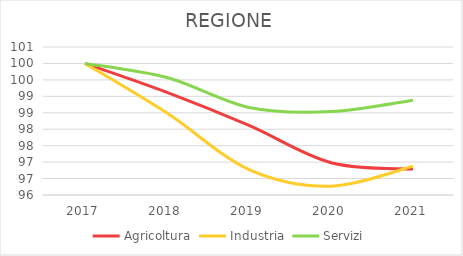
| Category | Agricoltura | Industria | Servizi |
|---|---|---|---|
| 2017.0 | 100 | 100 | 100 |
| 2018.0 | 99.119 | 98.491 | 99.571 |
| 2019.0 | 98.114 | 96.774 | 98.661 |
| 2020.0 | 96.983 | 96.269 | 98.536 |
| 2021.0 | 96.787 | 96.873 | 98.884 |